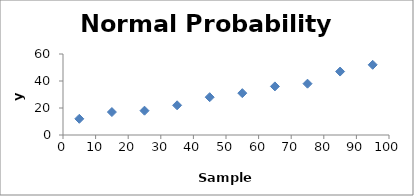
| Category | Series 0 |
|---|---|
| 5.0 | 12 |
| 15.0 | 17 |
| 25.0 | 18 |
| 35.0 | 22 |
| 45.0 | 28 |
| 55.0 | 31 |
| 65.0 | 36 |
| 75.0 | 38 |
| 85.0 | 47 |
| 95.0 | 52 |